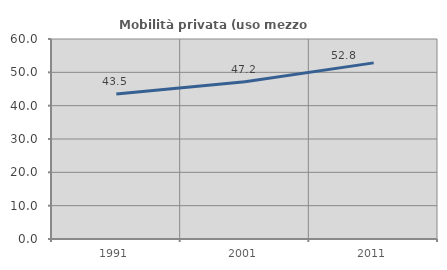
| Category | Mobilità privata (uso mezzo privato) |
|---|---|
| 1991.0 | 43.487 |
| 2001.0 | 47.186 |
| 2011.0 | 52.838 |